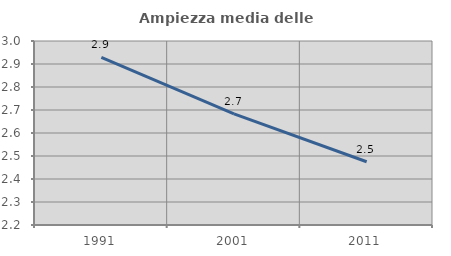
| Category | Ampiezza media delle famiglie |
|---|---|
| 1991.0 | 2.929 |
| 2001.0 | 2.683 |
| 2011.0 | 2.475 |